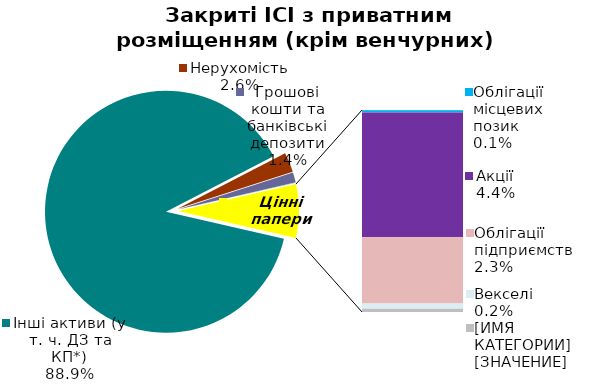
| Category | Series 0 |
|---|---|
| Інші активи (у т. ч. ДЗ та КП*) | 0.889 |
| Нерухомість | 0.026 |
| Грошові кошти та банківські депозити | 0.014 |
| Банківські метали | 0 |
| Облігації державні (у т.ч. ОВДП) | 0 |
| Облігації місцевих позик | 0.001 |
| Акції | 0.044 |
| Облігації підприємств | 0.023 |
| Векселі | 0.002 |
| Інші ЦП  | 0.001 |